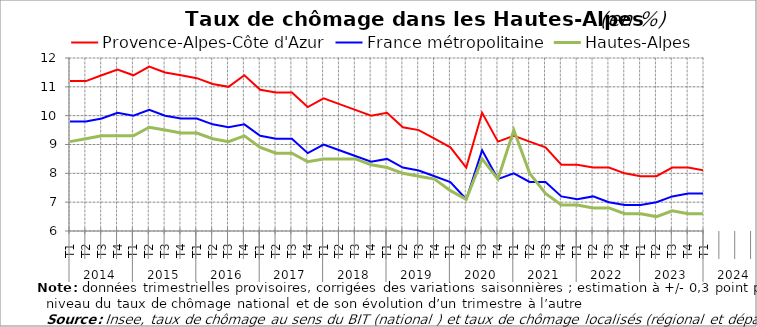
| Category | Provence-Alpes-Côte d'Azur | France métropolitaine | Hautes-Alpes |
|---|---|---|---|
| 0 | 11.2 | 9.8 | 9.1 |
| 1 | 11.2 | 9.8 | 9.2 |
| 2 | 11.4 | 9.9 | 9.3 |
| 3 | 11.6 | 10.1 | 9.3 |
| 4 | 11.4 | 10 | 9.3 |
| 5 | 11.7 | 10.2 | 9.6 |
| 6 | 11.5 | 10 | 9.5 |
| 7 | 11.4 | 9.9 | 9.4 |
| 8 | 11.3 | 9.9 | 9.4 |
| 9 | 11.1 | 9.7 | 9.2 |
| 10 | 11 | 9.6 | 9.1 |
| 11 | 11.4 | 9.7 | 9.3 |
| 12 | 10.9 | 9.3 | 8.9 |
| 13 | 10.8 | 9.2 | 8.7 |
| 14 | 10.8 | 9.2 | 8.7 |
| 15 | 10.3 | 8.7 | 8.4 |
| 16 | 10.6 | 9 | 8.5 |
| 17 | 10.4 | 8.8 | 8.5 |
| 18 | 10.2 | 8.6 | 8.5 |
| 19 | 10 | 8.4 | 8.3 |
| 20 | 10.1 | 8.5 | 8.2 |
| 21 | 9.6 | 8.2 | 8 |
| 22 | 9.5 | 8.1 | 7.9 |
| 23 | 9.2 | 7.9 | 7.8 |
| 24 | 8.9 | 7.7 | 7.4 |
| 25 | 8.2 | 7.1 | 7.1 |
| 26 | 10.1 | 8.8 | 8.5 |
| 27 | 9.1 | 7.8 | 7.8 |
| 28 | 9.3 | 8 | 9.5 |
| 29 | 9.1 | 7.7 | 8 |
| 30 | 8.9 | 7.7 | 7.3 |
| 31 | 8.3 | 7.2 | 6.9 |
| 32 | 8.3 | 7.1 | 6.9 |
| 33 | 8.2 | 7.2 | 6.8 |
| 34 | 8.2 | 7 | 6.8 |
| 35 | 8 | 6.9 | 6.6 |
| 36 | 7.9 | 6.9 | 6.6 |
| 37 | 7.9 | 7 | 6.5 |
| 38 | 8.2 | 7.2 | 6.7 |
| 39 | 8.2 | 7.3 | 6.6 |
| 40 | 8.1 | 7.3 | 6.6 |